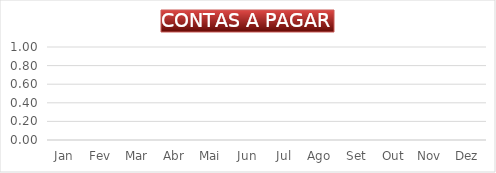
| Category | CONTAS A PAGAR |
|---|---|
| Jan | 0 |
| Fev | 0 |
| Mar | 0 |
| Abr | 0 |
| Mai | 0 |
| Jun | 0 |
| Jul | 0 |
| Ago | 0 |
| Set | 0 |
| Out | 0 |
| Nov | 0 |
| Dez | 0 |